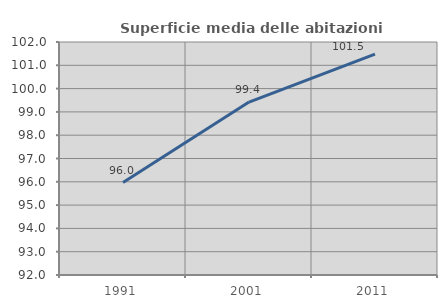
| Category | Superficie media delle abitazioni occupate |
|---|---|
| 1991.0 | 95.967 |
| 2001.0 | 99.423 |
| 2011.0 | 101.48 |